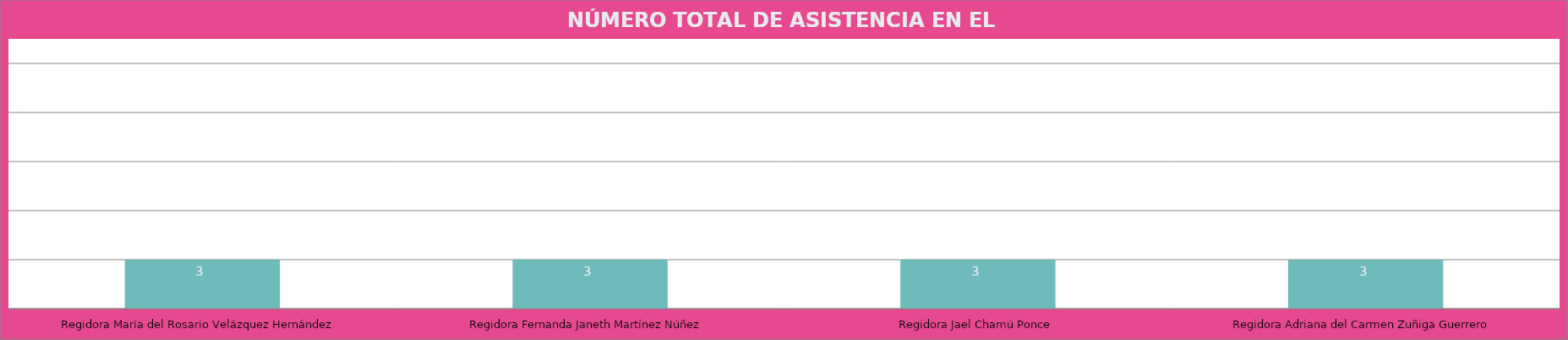
| Category | Regidora María del Rosario Velázquez Hernández |
|---|---|
| Regidora María del Rosario Velázquez Hernández | 3 |
| Regidora Fernanda Janeth Martínez Núñez | 3 |
| Regidora Jael Chamú Ponce | 3 |
| Regidora Adriana del Carmen Zuñiga Guerrero | 3 |